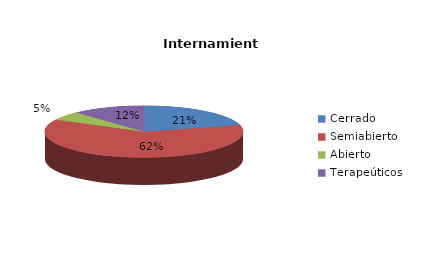
| Category | Series 0 |
|---|---|
| Cerrado | 160 |
| Semiabierto | 475 |
| Abierto | 42 |
| Terapeúticos | 91 |